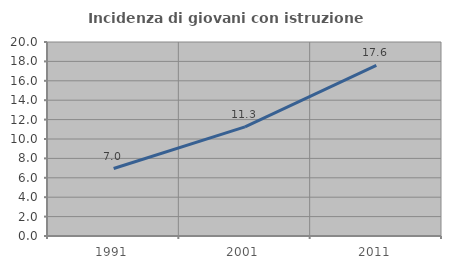
| Category | Incidenza di giovani con istruzione universitaria |
|---|---|
| 1991.0 | 6.957 |
| 2001.0 | 11.25 |
| 2011.0 | 17.6 |